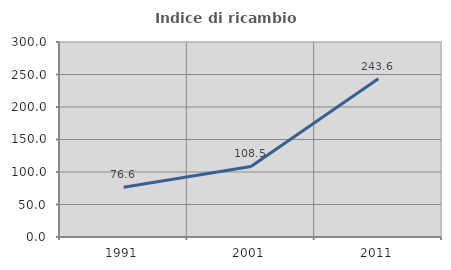
| Category | Indice di ricambio occupazionale  |
|---|---|
| 1991.0 | 76.63 |
| 2001.0 | 108.511 |
| 2011.0 | 243.598 |